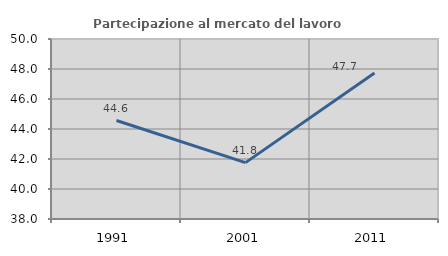
| Category | Partecipazione al mercato del lavoro  femminile |
|---|---|
| 1991.0 | 44.565 |
| 2001.0 | 41.758 |
| 2011.0 | 47.727 |